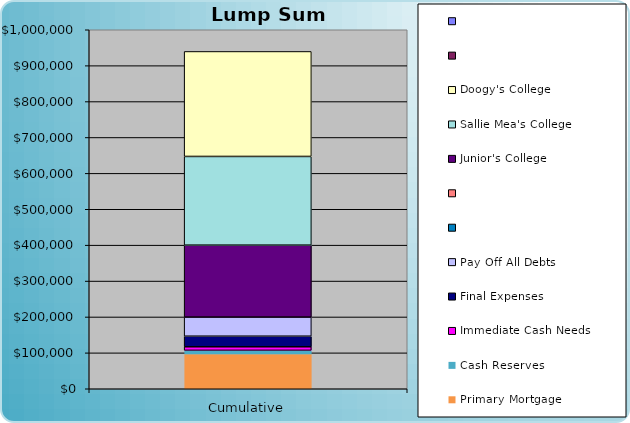
| Category | Primary Mortgage | Cash Reserves | Immediate Cash Needs | Final Expenses | Pay Off All Debts |   | Junior's College | Sallie Mea's College | Doogy's College |
|---|---|---|---|---|---|---|---|---|---|
| 0 | 96905.178 | 10000 | 10000 | 29500 | 53228.929 | 0 | 200362.394 | 247104.059 | 292482.725 |